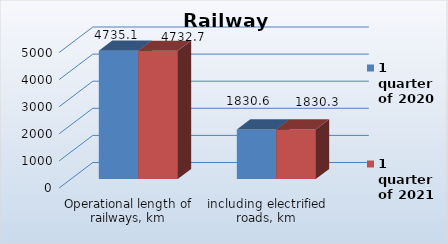
| Category | 1 quarter of 2020 | 1 quarter of 2021 |
|---|---|---|
| Operational length of railways, km | 4735.1 | 4732.7 |
| including electrified roads, km | 1830.6 | 1830.3 |